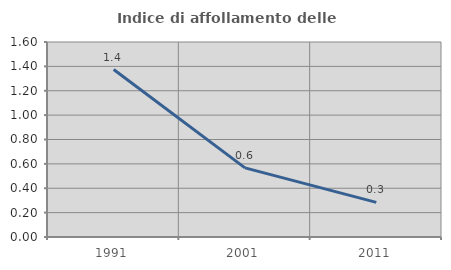
| Category | Indice di affollamento delle abitazioni  |
|---|---|
| 1991.0 | 1.374 |
| 2001.0 | 0.568 |
| 2011.0 | 0.284 |